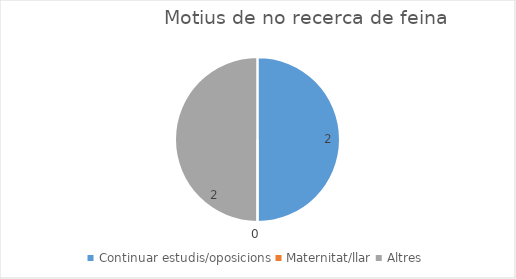
| Category | Series 0 |
|---|---|
| Continuar estudis/oposicions | 2 |
| Maternitat/llar | 0 |
| Altres | 2 |